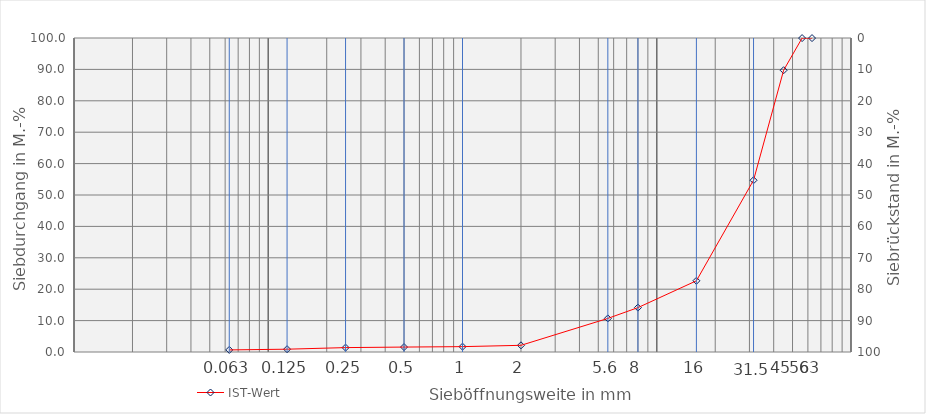
| Category | Series 10 |
|---|---|
| 0.0 | 0 |
| 0.063 | 0 |
| 0.125 | 0 |
| 0.25 | 0 |
| 0.5 | 0 |
| 1.0 | 0 |
| 2.0 | 0 |
| 5.6 | 0 |
| 8.0 | 0 |
| 16.0 | 0 |
| 31.5 | 0 |
| 45.0 | 0 |
| 56.0 | 0 |
| 63.0 | 0 |